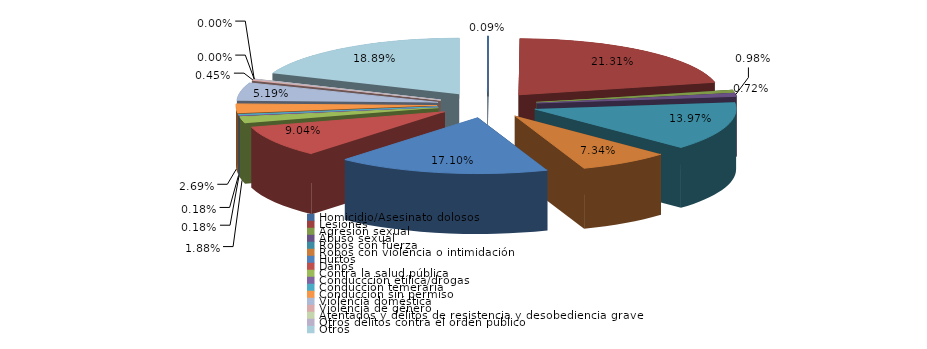
| Category | Series 0 |
|---|---|
| Homicidio/Asesinato dolosos | 1 |
| Lesiones | 238 |
| Agresión sexual | 8 |
| Abuso sexual | 11 |
| Robos con fuerza | 156 |
| Robos con violencia o intimidación | 82 |
| Hurtos | 191 |
| Daños | 101 |
| Contra la salud pública | 21 |
| Conduccción etílica/drogas | 2 |
| Conducción temeraria | 2 |
| Conducción sin permiso | 30 |
| Violencia doméstica | 58 |
| Violencia de género | 5 |
| Atentados y delitos de resistencia y desobediencia grave | 0 |
| Otros delitos contra el orden público | 0 |
| Otros | 211 |